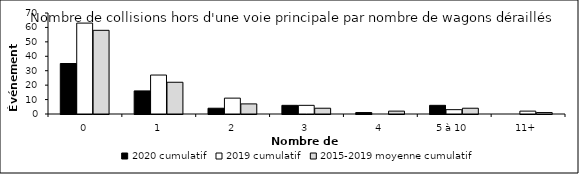
| Category | 2020 cumulatif | 2019 cumulatif | 2015-2019 moyenne cumulatif |
|---|---|---|---|
| 0 | 35 | 63 | 58 |
| 1 | 16 | 27 | 22 |
| 2 | 4 | 11 | 7 |
| 3 | 6 | 6 | 4 |
| 4 | 1 | 0 | 2 |
| 5 à 10 | 6 | 3 | 4 |
| 11+ | 0 | 2 | 1 |